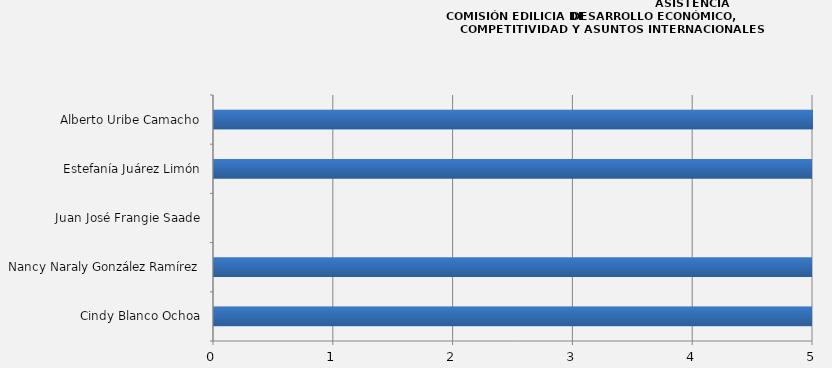
| Category | Series 0 |
|---|---|
| Cindy Blanco Ochoa | 13 |
| Nancy Naraly González Ramírez | 13 |
| Juan José Frangie Saade | 0 |
| Estefanía Juárez Limón | 13 |
| Alberto Uribe Camacho | 5 |